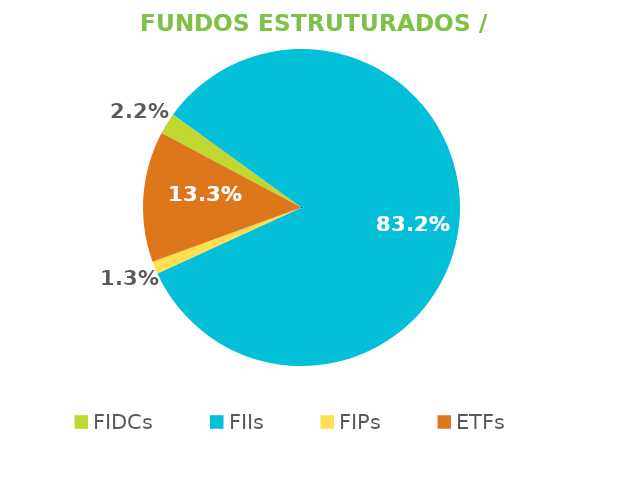
| Category | Fundos Estruturados / ETFs |
|---|---|
| FIDCs | 0.022 |
| FIIs | 0.832 |
| FIPs | 0.013 |
| ETFs | 0.133 |